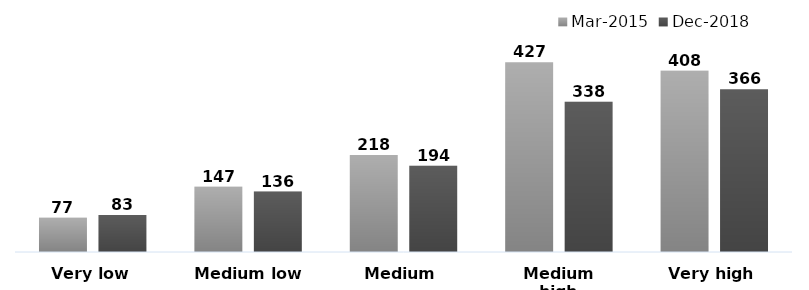
| Category | Mar-2015 | Dec-2018 |
|---|---|---|
| Very low | 77 | 83 |
| Medium low | 147 | 136 |
| Medium | 218 | 194 |
| Medium high | 427 | 338 |
| Very high | 408 | 366 |